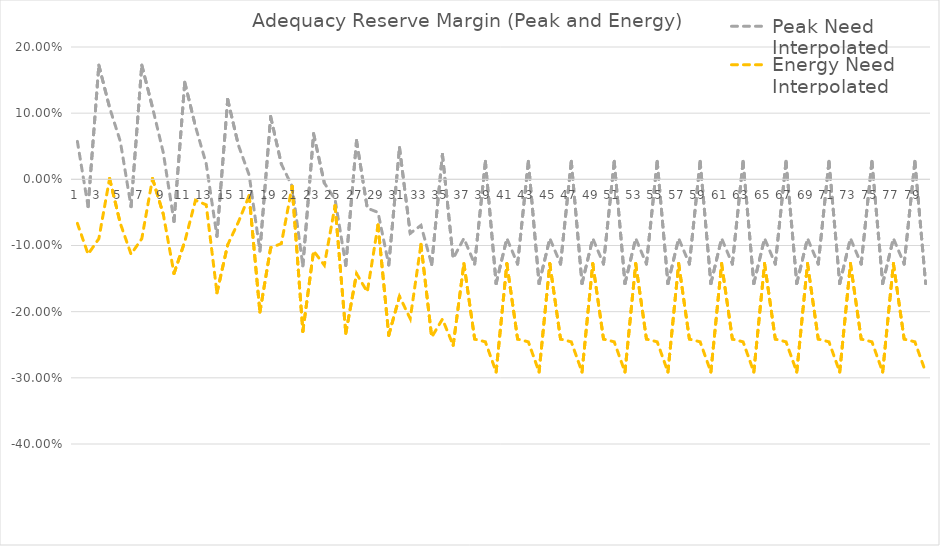
| Category | Peak Need Interpolated | Energy Need Interpolated |
|---|---|---|
| 0 | 0.057 | -0.067 |
| 1 | -0.041 | -0.113 |
| 2 | 0.173 | -0.09 |
| 3 | 0.108 | 0.001 |
| 4 | 0.057 | -0.067 |
| 5 | -0.041 | -0.113 |
| 6 | 0.173 | -0.09 |
| 7 | 0.108 | 0.001 |
| 8 | 0.04 | -0.053 |
| 9 | -0.064 | -0.142 |
| 10 | 0.147 | -0.094 |
| 11 | 0.08 | -0.032 |
| 12 | 0.023 | -0.039 |
| 13 | -0.086 | -0.171 |
| 14 | 0.121 | -0.099 |
| 15 | 0.051 | -0.064 |
| 16 | 0.006 | -0.025 |
| 17 | -0.108 | -0.201 |
| 18 | 0.095 | -0.104 |
| 19 | 0.023 | -0.097 |
| 20 | -0.011 | -0.011 |
| 21 | -0.131 | -0.23 |
| 22 | 0.069 | -0.108 |
| 23 | -0.006 | -0.13 |
| 24 | -0.03 | -0.04 |
| 25 | -0.13 | -0.233 |
| 26 | 0.058 | -0.143 |
| 27 | -0.044 | -0.17 |
| 28 | -0.05 | -0.069 |
| 29 | -0.129 | -0.236 |
| 30 | 0.048 | -0.177 |
| 31 | -0.082 | -0.211 |
| 32 | -0.07 | -0.098 |
| 33 | -0.129 | -0.239 |
| 34 | 0.038 | -0.211 |
| 35 | -0.12 | -0.251 |
| 36 | -0.089 | -0.127 |
| 37 | -0.128 | -0.241 |
| 38 | 0.027 | -0.246 |
| 39 | -0.158 | -0.291 |
| 40 | -0.089 | -0.127 |
| 41 | -0.128 | -0.241 |
| 42 | 0.027 | -0.246 |
| 43 | -0.158 | -0.291 |
| 44 | -0.089 | -0.127 |
| 45 | -0.128 | -0.241 |
| 46 | 0.027 | -0.246 |
| 47 | -0.158 | -0.291 |
| 48 | -0.089 | -0.127 |
| 49 | -0.128 | -0.241 |
| 50 | 0.027 | -0.246 |
| 51 | -0.158 | -0.291 |
| 52 | -0.089 | -0.127 |
| 53 | -0.128 | -0.241 |
| 54 | 0.027 | -0.246 |
| 55 | -0.158 | -0.291 |
| 56 | -0.089 | -0.127 |
| 57 | -0.128 | -0.241 |
| 58 | 0.027 | -0.246 |
| 59 | -0.158 | -0.291 |
| 60 | -0.089 | -0.127 |
| 61 | -0.128 | -0.241 |
| 62 | 0.027 | -0.246 |
| 63 | -0.158 | -0.291 |
| 64 | -0.089 | -0.127 |
| 65 | -0.128 | -0.241 |
| 66 | 0.027 | -0.246 |
| 67 | -0.158 | -0.291 |
| 68 | -0.089 | -0.127 |
| 69 | -0.128 | -0.241 |
| 70 | 0.027 | -0.246 |
| 71 | -0.158 | -0.291 |
| 72 | -0.089 | -0.127 |
| 73 | -0.128 | -0.241 |
| 74 | 0.027 | -0.246 |
| 75 | -0.158 | -0.291 |
| 76 | -0.089 | -0.127 |
| 77 | -0.128 | -0.241 |
| 78 | 0.027 | -0.246 |
| 79 | -0.158 | -0.291 |